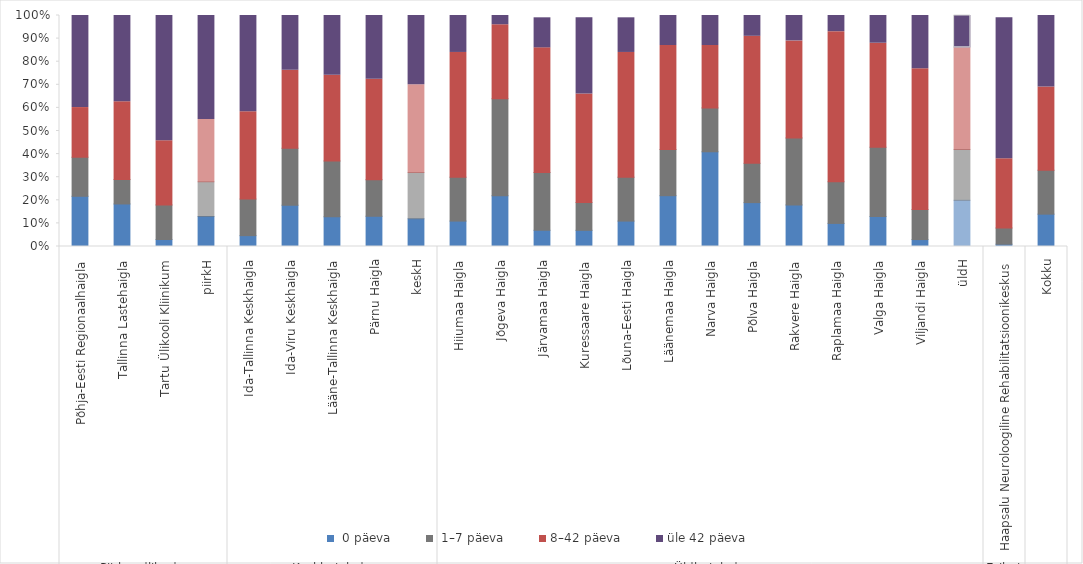
| Category |  0 päeva |  1–7 päeva | 8–42 päeva | üle 42 päeva |
|---|---|---|---|---|
| 0 | 0.217 | 0.169 | 0.215 | 0.399 |
| 1 | 0.184 | 0.106 | 0.337 | 0.373 |
| 2 | 0.03 | 0.15 | 0.278 | 0.542 |
| 3 | 0.13 | 0.15 | 0.27 | 0.46 |
| 4 | 0.047 | 0.158 | 0.379 | 0.416 |
| 5 | 0.179 | 0.246 | 0.338 | 0.237 |
| 6 | 0.129 | 0.242 | 0.371 | 0.258 |
| 7 | 0.131 | 0.158 | 0.435 | 0.276 |
| 8 | 0.12 | 0.2 | 0.38 | 0.3 |
| 9 | 0.11 | 0.19 | 0.54 | 0.16 |
| 10 | 0.22 | 0.42 | 0.32 | 0.04 |
| 11 | 0.07 | 0.25 | 0.54 | 0.13 |
| 12 | 0.07 | 0.12 | 0.47 | 0.33 |
| 13 | 0.11 | 0.19 | 0.54 | 0.15 |
| 14 | 0.22 | 0.2 | 0.45 | 0.13 |
| 15 | 0.41 | 0.19 | 0.27 | 0.14 |
| 16 | 0.19 | 0.17 | 0.55 | 0.1 |
| 17 | 0.18 | 0.29 | 0.42 | 0.11 |
| 18 | 0.1 | 0.18 | 0.65 | 0.07 |
| 19 | 0.13 | 0.3 | 0.45 | 0.12 |
| 20 | 0.03 | 0.13 | 0.61 | 0.23 |
| 21 | 0.2 | 0.22 | 0.44 | 0.14 |
| 22 | 0.01 | 0.07 | 0.3 | 0.61 |
| 23 | 0.14 | 0.19 | 0.36 | 0.31 |